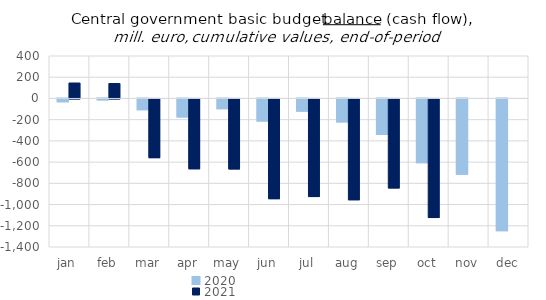
| Category | 2020 | 2021 |
|---|---|---|
| jan | -27008.783 | 145495.451 |
| feb | -9269.524 | 140973.019 |
| mar | -101706.886 | -553552.963 |
| apr | -170325.644 | -658430.761 |
| may | -92020.586 | -659587.172 |
| jun | -208697 | -939419.413 |
| jul | -115099.532 | -920391.102 |
| aug | -216342.463 | -950438.335 |
| sep | -335327.721 | -838941.258 |
| oct | -600909.808 | -1117742.949 |
| nov | -709090.366 | 0 |
| dec | -1241962.025 | 0 |